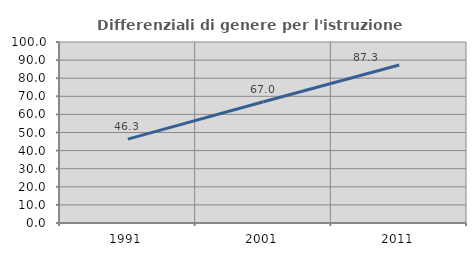
| Category | Differenziali di genere per l'istruzione superiore |
|---|---|
| 1991.0 | 46.33 |
| 2001.0 | 66.977 |
| 2011.0 | 87.308 |